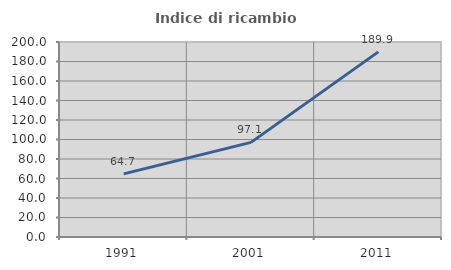
| Category | Indice di ricambio occupazionale  |
|---|---|
| 1991.0 | 64.706 |
| 2001.0 | 97.073 |
| 2011.0 | 189.893 |